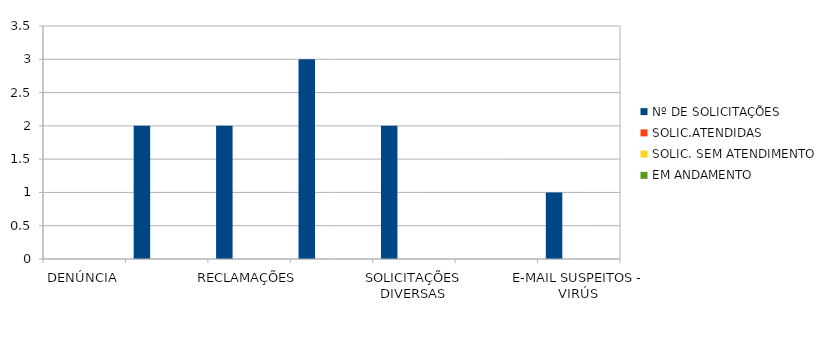
| Category | Nº DE SOLICITAÇÕES | SOLIC.ATENDIDAS | SOLIC. SEM ATENDIMENTO | EM ANDAMENTO |
|---|---|---|---|---|
| DENÚNCIA | 0 | 0 | 0 | 0 |
| DÚVIDA | 2 | 0 | 0 | 0 |
| RECLAMAÇÕES | 2 | 0 | 0 | 0 |
| PEDIDO DE ACESSO À INFORMAÇÃO | 3 | 0 | 0 | 0 |
| SOLICITAÇÕES DIVERSAS | 2 | 0 | 0 | 0 |
| SUGESTÃO  | 0 | 0 | 0 | 0 |
| E-MAIL SUSPEITOS - VIRÚS | 1 | 0 | 0 | 0 |